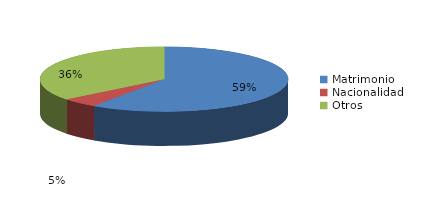
| Category | Series 0 |
|---|---|
| Matrimonio | 273 |
| Nacionalidad | 22 |
| Otros | 164 |